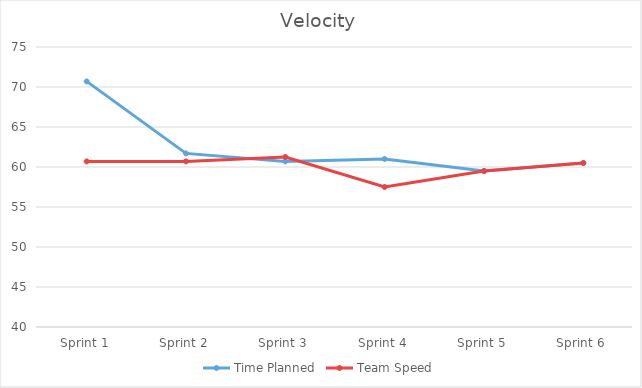
| Category | Time Planned | Team Speed |
|---|---|---|
| Sprint 1 | 70.7 | 60.7 |
| Sprint 2 | 61.7 | 60.7 |
| Sprint 3 | 60.7 | 61.25 |
| Sprint 4 | 61 | 57.5 |
| Sprint 5 | 59.5 | 59.5 |
| Sprint 6 | 60.5 | 60.5 |